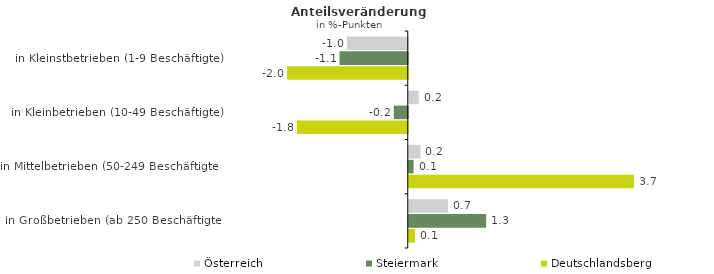
| Category | Österreich | Steiermark | Deutschlandsberg |
|---|---|---|---|
| in Kleinstbetrieben (1-9 Beschäftigte) | -1.011 | -1.133 | -2.002 |
| in Kleinbetrieben (10-49 Beschäftigte) | 0.167 | -0.232 | -1.841 |
| in Mittelbetrieben (50-249 Beschäftigte) | 0.193 | 0.081 | 3.738 |
| in Großbetrieben (ab 250 Beschäftigte) | 0.651 | 1.284 | 0.103 |